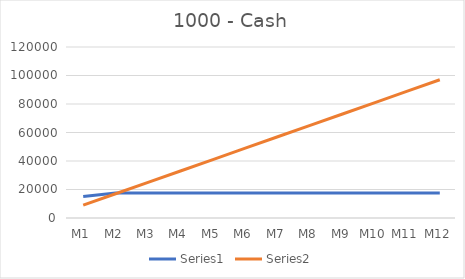
| Category | Series 0 | Series 1 |
|---|---|---|
| M1 | 15070 | 9000 |
| M2 | 17570 | 17000 |
| M3 | 17570 | 25000 |
| M4 | 17570 | 33000 |
| M5 | 17570 | 41000 |
| M6 | 17570 | 49000 |
| M7 | 17570 | 57000 |
| M8 | 17570 | 65000 |
| M9 | 17570 | 73000 |
| M10 | 17570 | 81000 |
| M11 | 17570 | 89000 |
| M12 | 17570 | 97000 |